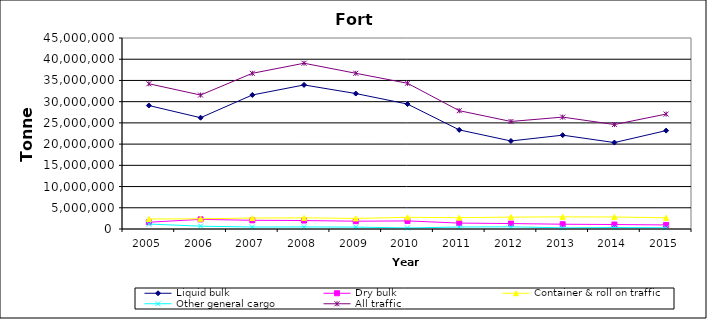
| Category | Liquid bulk | Dry bulk | Container & roll on traffic | Other general cargo | All traffic |
|---|---|---|---|---|---|
| 2005.0 | 29090000 | 1596000 | 2361000 | 1171000 | 34218000 |
| 2006.0 | 26220000 | 2264000 | 2407000 | 663000 | 31556000 |
| 2007.0 | 31578000 | 2051000 | 2582000 | 470000 | 36681000 |
| 2008.0 | 33941000 | 1994000 | 2627000 | 492000 | 39054000 |
| 2009.0 | 31913166 | 1840497 | 2494191 | 442331 | 36690185 |
| 2010.0 | 29432000 | 1904000 | 2751000 | 249000 | 34335000 |
| 2011.0 | 23353000 | 1392000 | 2666000 | 466000 | 27878000 |
| 2012.0 | 20739000 | 1283000 | 2798000 | 512000 | 25332000 |
| 2013.0 | 22109000 | 1125000 | 2858000 | 273000 | 26365000 |
| 2014.0 | 20363000 | 1056000 | 2834000 | 355000 | 24608000 |
| 2015.0 | 23183000 | 958000 | 2643000 | 290000 | 27074000 |